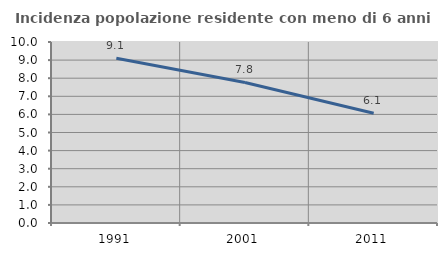
| Category | Incidenza popolazione residente con meno di 6 anni |
|---|---|
| 1991.0 | 9.106 |
| 2001.0 | 7.762 |
| 2011.0 | 6.061 |